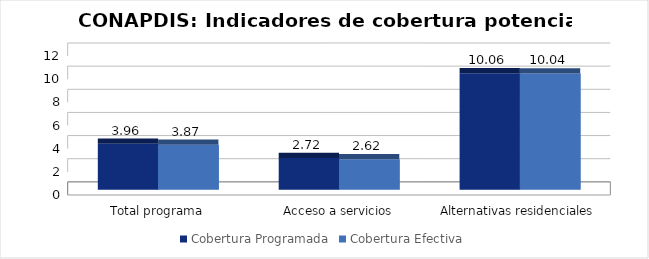
| Category | Cobertura Programada | Cobertura Efectiva |
|---|---|---|
| Total programa | 3.963 | 3.87 |
| Acceso a servicios | 2.722 | 2.616 |
| Alternativas residenciales | 10.063 | 10.038 |